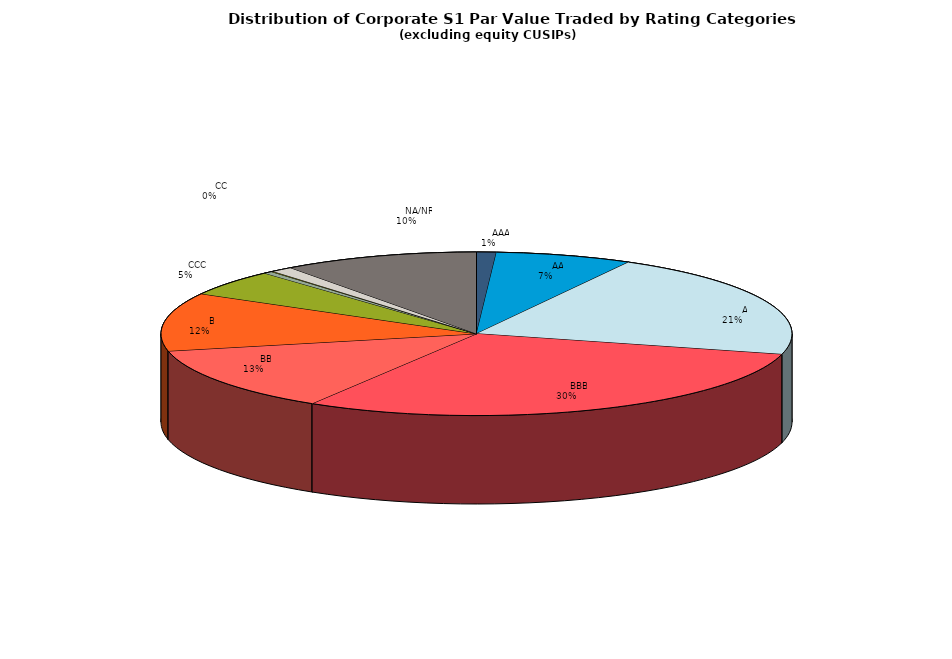
| Category | Series 0 |
|---|---|
|         AAA | 282279020.324 |
|         AA | 1955135050.169 |
|         A | 5881880932.401 |
|         BBB | 8287808973.577 |
|         BB | 3601542100.204 |
|         B | 3219569342.59 |
|         CCC | 1441607199.478 |
|         CC | 123718694.274 |
|         C | 29002926.234 |
|         D | 312965187.357 |
|         NA/NR | 2804303000.832 |